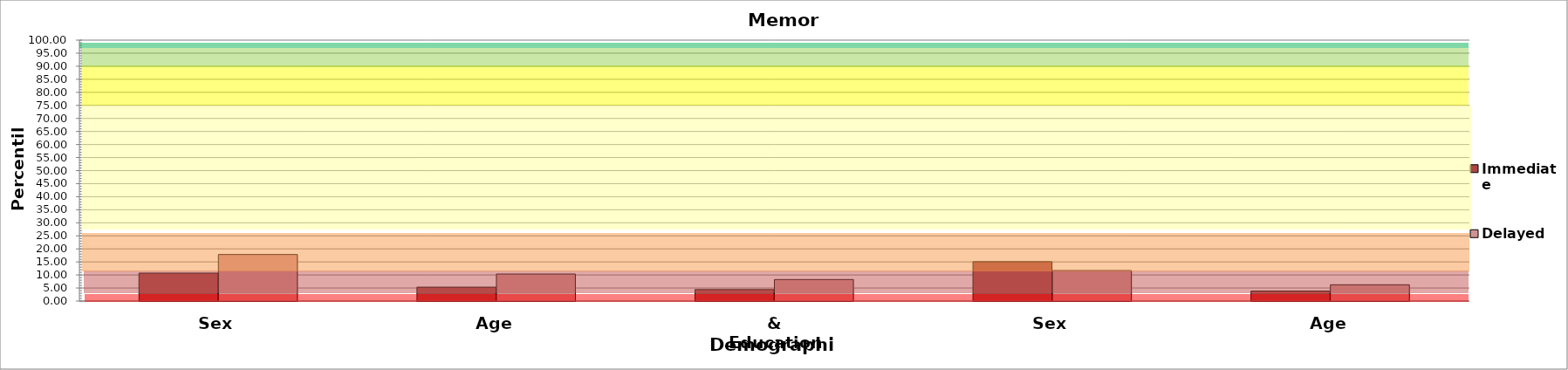
| Category | Immediate | Delayed |
|---|---|---|
| 0 | 10.711 | 17.839 |
| 1 | 5.329 | 10.367 |
| 2 | 4.405 | 8.256 |
| 3 | 15.088 | 11.705 |
| 4 | 3.843 | 6.241 |